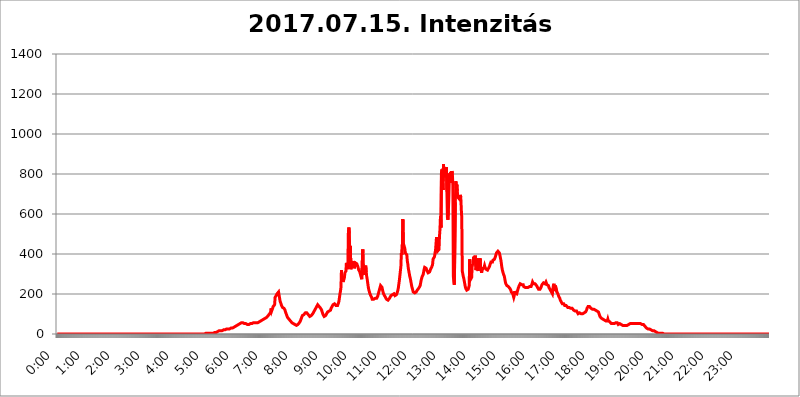
| Category | 2017.07.15. Intenzitás [W/m^2] |
|---|---|
| 0.0 | 0 |
| 0.0006944444444444445 | 0 |
| 0.001388888888888889 | 0 |
| 0.0020833333333333333 | 0 |
| 0.002777777777777778 | 0 |
| 0.003472222222222222 | 0 |
| 0.004166666666666667 | 0 |
| 0.004861111111111111 | 0 |
| 0.005555555555555556 | 0 |
| 0.0062499999999999995 | 0 |
| 0.006944444444444444 | 0 |
| 0.007638888888888889 | 0 |
| 0.008333333333333333 | 0 |
| 0.009027777777777779 | 0 |
| 0.009722222222222222 | 0 |
| 0.010416666666666666 | 0 |
| 0.011111111111111112 | 0 |
| 0.011805555555555555 | 0 |
| 0.012499999999999999 | 0 |
| 0.013194444444444444 | 0 |
| 0.013888888888888888 | 0 |
| 0.014583333333333332 | 0 |
| 0.015277777777777777 | 0 |
| 0.015972222222222224 | 0 |
| 0.016666666666666666 | 0 |
| 0.017361111111111112 | 0 |
| 0.018055555555555557 | 0 |
| 0.01875 | 0 |
| 0.019444444444444445 | 0 |
| 0.02013888888888889 | 0 |
| 0.020833333333333332 | 0 |
| 0.02152777777777778 | 0 |
| 0.022222222222222223 | 0 |
| 0.02291666666666667 | 0 |
| 0.02361111111111111 | 0 |
| 0.024305555555555556 | 0 |
| 0.024999999999999998 | 0 |
| 0.025694444444444447 | 0 |
| 0.02638888888888889 | 0 |
| 0.027083333333333334 | 0 |
| 0.027777777777777776 | 0 |
| 0.02847222222222222 | 0 |
| 0.029166666666666664 | 0 |
| 0.029861111111111113 | 0 |
| 0.030555555555555555 | 0 |
| 0.03125 | 0 |
| 0.03194444444444445 | 0 |
| 0.03263888888888889 | 0 |
| 0.03333333333333333 | 0 |
| 0.034027777777777775 | 0 |
| 0.034722222222222224 | 0 |
| 0.035416666666666666 | 0 |
| 0.036111111111111115 | 0 |
| 0.03680555555555556 | 0 |
| 0.0375 | 0 |
| 0.03819444444444444 | 0 |
| 0.03888888888888889 | 0 |
| 0.03958333333333333 | 0 |
| 0.04027777777777778 | 0 |
| 0.04097222222222222 | 0 |
| 0.041666666666666664 | 0 |
| 0.042361111111111106 | 0 |
| 0.04305555555555556 | 0 |
| 0.043750000000000004 | 0 |
| 0.044444444444444446 | 0 |
| 0.04513888888888889 | 0 |
| 0.04583333333333334 | 0 |
| 0.04652777777777778 | 0 |
| 0.04722222222222222 | 0 |
| 0.04791666666666666 | 0 |
| 0.04861111111111111 | 0 |
| 0.049305555555555554 | 0 |
| 0.049999999999999996 | 0 |
| 0.05069444444444445 | 0 |
| 0.051388888888888894 | 0 |
| 0.052083333333333336 | 0 |
| 0.05277777777777778 | 0 |
| 0.05347222222222222 | 0 |
| 0.05416666666666667 | 0 |
| 0.05486111111111111 | 0 |
| 0.05555555555555555 | 0 |
| 0.05625 | 0 |
| 0.05694444444444444 | 0 |
| 0.057638888888888885 | 0 |
| 0.05833333333333333 | 0 |
| 0.05902777777777778 | 0 |
| 0.059722222222222225 | 0 |
| 0.06041666666666667 | 0 |
| 0.061111111111111116 | 0 |
| 0.06180555555555556 | 0 |
| 0.0625 | 0 |
| 0.06319444444444444 | 0 |
| 0.06388888888888888 | 0 |
| 0.06458333333333334 | 0 |
| 0.06527777777777778 | 0 |
| 0.06597222222222222 | 0 |
| 0.06666666666666667 | 0 |
| 0.06736111111111111 | 0 |
| 0.06805555555555555 | 0 |
| 0.06874999999999999 | 0 |
| 0.06944444444444443 | 0 |
| 0.07013888888888889 | 0 |
| 0.07083333333333333 | 0 |
| 0.07152777777777779 | 0 |
| 0.07222222222222223 | 0 |
| 0.07291666666666667 | 0 |
| 0.07361111111111111 | 0 |
| 0.07430555555555556 | 0 |
| 0.075 | 0 |
| 0.07569444444444444 | 0 |
| 0.0763888888888889 | 0 |
| 0.07708333333333334 | 0 |
| 0.07777777777777778 | 0 |
| 0.07847222222222222 | 0 |
| 0.07916666666666666 | 0 |
| 0.0798611111111111 | 0 |
| 0.08055555555555556 | 0 |
| 0.08125 | 0 |
| 0.08194444444444444 | 0 |
| 0.08263888888888889 | 0 |
| 0.08333333333333333 | 0 |
| 0.08402777777777777 | 0 |
| 0.08472222222222221 | 0 |
| 0.08541666666666665 | 0 |
| 0.08611111111111112 | 0 |
| 0.08680555555555557 | 0 |
| 0.08750000000000001 | 0 |
| 0.08819444444444445 | 0 |
| 0.08888888888888889 | 0 |
| 0.08958333333333333 | 0 |
| 0.09027777777777778 | 0 |
| 0.09097222222222222 | 0 |
| 0.09166666666666667 | 0 |
| 0.09236111111111112 | 0 |
| 0.09305555555555556 | 0 |
| 0.09375 | 0 |
| 0.09444444444444444 | 0 |
| 0.09513888888888888 | 0 |
| 0.09583333333333333 | 0 |
| 0.09652777777777777 | 0 |
| 0.09722222222222222 | 0 |
| 0.09791666666666667 | 0 |
| 0.09861111111111111 | 0 |
| 0.09930555555555555 | 0 |
| 0.09999999999999999 | 0 |
| 0.10069444444444443 | 0 |
| 0.1013888888888889 | 0 |
| 0.10208333333333335 | 0 |
| 0.10277777777777779 | 0 |
| 0.10347222222222223 | 0 |
| 0.10416666666666667 | 0 |
| 0.10486111111111111 | 0 |
| 0.10555555555555556 | 0 |
| 0.10625 | 0 |
| 0.10694444444444444 | 0 |
| 0.1076388888888889 | 0 |
| 0.10833333333333334 | 0 |
| 0.10902777777777778 | 0 |
| 0.10972222222222222 | 0 |
| 0.1111111111111111 | 0 |
| 0.11180555555555556 | 0 |
| 0.11180555555555556 | 0 |
| 0.1125 | 0 |
| 0.11319444444444444 | 0 |
| 0.11388888888888889 | 0 |
| 0.11458333333333333 | 0 |
| 0.11527777777777777 | 0 |
| 0.11597222222222221 | 0 |
| 0.11666666666666665 | 0 |
| 0.1173611111111111 | 0 |
| 0.11805555555555557 | 0 |
| 0.11944444444444445 | 0 |
| 0.12013888888888889 | 0 |
| 0.12083333333333333 | 0 |
| 0.12152777777777778 | 0 |
| 0.12222222222222223 | 0 |
| 0.12291666666666667 | 0 |
| 0.12291666666666667 | 0 |
| 0.12361111111111112 | 0 |
| 0.12430555555555556 | 0 |
| 0.125 | 0 |
| 0.12569444444444444 | 0 |
| 0.12638888888888888 | 0 |
| 0.12708333333333333 | 0 |
| 0.16875 | 0 |
| 0.12847222222222224 | 0 |
| 0.12916666666666668 | 0 |
| 0.12986111111111112 | 0 |
| 0.13055555555555556 | 0 |
| 0.13125 | 0 |
| 0.13194444444444445 | 0 |
| 0.1326388888888889 | 0 |
| 0.13333333333333333 | 0 |
| 0.13402777777777777 | 0 |
| 0.13402777777777777 | 0 |
| 0.13472222222222222 | 0 |
| 0.13541666666666666 | 0 |
| 0.1361111111111111 | 0 |
| 0.13749999999999998 | 0 |
| 0.13819444444444443 | 0 |
| 0.1388888888888889 | 0 |
| 0.13958333333333334 | 0 |
| 0.14027777777777778 | 0 |
| 0.14097222222222222 | 0 |
| 0.14166666666666666 | 0 |
| 0.1423611111111111 | 0 |
| 0.14305555555555557 | 0 |
| 0.14375000000000002 | 0 |
| 0.14444444444444446 | 0 |
| 0.1451388888888889 | 0 |
| 0.1451388888888889 | 0 |
| 0.14652777777777778 | 0 |
| 0.14722222222222223 | 0 |
| 0.14791666666666667 | 0 |
| 0.1486111111111111 | 0 |
| 0.14930555555555555 | 0 |
| 0.15 | 0 |
| 0.15069444444444444 | 0 |
| 0.15138888888888888 | 0 |
| 0.15208333333333332 | 0 |
| 0.15277777777777776 | 0 |
| 0.15347222222222223 | 0 |
| 0.15416666666666667 | 0 |
| 0.15486111111111112 | 0 |
| 0.15555555555555556 | 0 |
| 0.15625 | 0 |
| 0.15694444444444444 | 0 |
| 0.15763888888888888 | 0 |
| 0.15833333333333333 | 0 |
| 0.15902777777777777 | 0 |
| 0.15972222222222224 | 0 |
| 0.16041666666666668 | 0 |
| 0.16111111111111112 | 0 |
| 0.16180555555555556 | 0 |
| 0.1625 | 0 |
| 0.16319444444444445 | 0 |
| 0.1638888888888889 | 0 |
| 0.16458333333333333 | 0 |
| 0.16527777777777777 | 0 |
| 0.16597222222222222 | 0 |
| 0.16666666666666666 | 0 |
| 0.1673611111111111 | 0 |
| 0.16805555555555554 | 0 |
| 0.16874999999999998 | 0 |
| 0.16944444444444443 | 0 |
| 0.17013888888888887 | 0 |
| 0.1708333333333333 | 0 |
| 0.17152777777777775 | 0 |
| 0.17222222222222225 | 0 |
| 0.1729166666666667 | 0 |
| 0.17361111111111113 | 0 |
| 0.17430555555555557 | 0 |
| 0.17500000000000002 | 0 |
| 0.17569444444444446 | 0 |
| 0.1763888888888889 | 0 |
| 0.17708333333333334 | 0 |
| 0.17777777777777778 | 0 |
| 0.17847222222222223 | 0 |
| 0.17916666666666667 | 0 |
| 0.1798611111111111 | 0 |
| 0.18055555555555555 | 0 |
| 0.18125 | 0 |
| 0.18194444444444444 | 0 |
| 0.1826388888888889 | 0 |
| 0.18333333333333335 | 0 |
| 0.1840277777777778 | 0 |
| 0.18472222222222223 | 0 |
| 0.18541666666666667 | 0 |
| 0.18611111111111112 | 0 |
| 0.18680555555555556 | 0 |
| 0.1875 | 0 |
| 0.18819444444444444 | 0 |
| 0.18888888888888888 | 0 |
| 0.18958333333333333 | 0 |
| 0.19027777777777777 | 0 |
| 0.1909722222222222 | 0 |
| 0.19166666666666665 | 0 |
| 0.19236111111111112 | 0 |
| 0.19305555555555554 | 0 |
| 0.19375 | 0 |
| 0.19444444444444445 | 0 |
| 0.1951388888888889 | 0 |
| 0.19583333333333333 | 0 |
| 0.19652777777777777 | 0 |
| 0.19722222222222222 | 0 |
| 0.19791666666666666 | 0 |
| 0.1986111111111111 | 0 |
| 0.19930555555555554 | 0 |
| 0.19999999999999998 | 0 |
| 0.20069444444444443 | 0 |
| 0.20138888888888887 | 0 |
| 0.2020833333333333 | 0 |
| 0.2027777777777778 | 0 |
| 0.2034722222222222 | 0 |
| 0.2041666666666667 | 0 |
| 0.20486111111111113 | 0 |
| 0.20555555555555557 | 0 |
| 0.20625000000000002 | 0 |
| 0.20694444444444446 | 0 |
| 0.2076388888888889 | 3.525 |
| 0.20833333333333334 | 3.525 |
| 0.20902777777777778 | 3.525 |
| 0.20972222222222223 | 3.525 |
| 0.21041666666666667 | 3.525 |
| 0.2111111111111111 | 3.525 |
| 0.21180555555555555 | 3.525 |
| 0.2125 | 3.525 |
| 0.21319444444444444 | 3.525 |
| 0.2138888888888889 | 3.525 |
| 0.21458333333333335 | 3.525 |
| 0.2152777777777778 | 3.525 |
| 0.21597222222222223 | 3.525 |
| 0.21666666666666667 | 3.525 |
| 0.21736111111111112 | 3.525 |
| 0.21805555555555556 | 3.525 |
| 0.21875 | 3.525 |
| 0.21944444444444444 | 7.887 |
| 0.22013888888888888 | 7.887 |
| 0.22083333333333333 | 7.887 |
| 0.22152777777777777 | 7.887 |
| 0.2222222222222222 | 7.887 |
| 0.22291666666666665 | 7.887 |
| 0.2236111111111111 | 7.887 |
| 0.22430555555555556 | 12.257 |
| 0.225 | 12.257 |
| 0.22569444444444445 | 12.257 |
| 0.2263888888888889 | 12.257 |
| 0.22708333333333333 | 16.636 |
| 0.22777777777777777 | 16.636 |
| 0.22847222222222222 | 16.636 |
| 0.22916666666666666 | 16.636 |
| 0.2298611111111111 | 16.636 |
| 0.23055555555555554 | 16.636 |
| 0.23124999999999998 | 16.636 |
| 0.23194444444444443 | 16.636 |
| 0.23263888888888887 | 21.024 |
| 0.2333333333333333 | 21.024 |
| 0.2340277777777778 | 21.024 |
| 0.2347222222222222 | 21.024 |
| 0.2354166666666667 | 21.024 |
| 0.23611111111111113 | 21.024 |
| 0.23680555555555557 | 25.419 |
| 0.23750000000000002 | 25.419 |
| 0.23819444444444446 | 25.419 |
| 0.2388888888888889 | 29.823 |
| 0.23958333333333334 | 25.419 |
| 0.24027777777777778 | 25.419 |
| 0.24097222222222223 | 25.419 |
| 0.24166666666666667 | 25.419 |
| 0.2423611111111111 | 29.823 |
| 0.24305555555555555 | 29.823 |
| 0.24375 | 29.823 |
| 0.24444444444444446 | 29.823 |
| 0.24513888888888888 | 29.823 |
| 0.24583333333333335 | 29.823 |
| 0.2465277777777778 | 34.234 |
| 0.24722222222222223 | 34.234 |
| 0.24791666666666667 | 34.234 |
| 0.24861111111111112 | 34.234 |
| 0.24930555555555556 | 38.653 |
| 0.25 | 38.653 |
| 0.25069444444444444 | 38.653 |
| 0.2513888888888889 | 38.653 |
| 0.2520833333333333 | 43.079 |
| 0.25277777777777777 | 43.079 |
| 0.2534722222222222 | 43.079 |
| 0.25416666666666665 | 47.511 |
| 0.2548611111111111 | 47.511 |
| 0.2555555555555556 | 47.511 |
| 0.25625000000000003 | 51.951 |
| 0.2569444444444445 | 51.951 |
| 0.2576388888888889 | 51.951 |
| 0.25833333333333336 | 56.398 |
| 0.2590277777777778 | 56.398 |
| 0.25972222222222224 | 56.398 |
| 0.2604166666666667 | 56.398 |
| 0.2611111111111111 | 51.951 |
| 0.26180555555555557 | 51.951 |
| 0.2625 | 51.951 |
| 0.26319444444444445 | 51.951 |
| 0.2638888888888889 | 51.951 |
| 0.26458333333333334 | 51.951 |
| 0.2652777777777778 | 51.951 |
| 0.2659722222222222 | 51.951 |
| 0.26666666666666666 | 47.511 |
| 0.2673611111111111 | 47.511 |
| 0.26805555555555555 | 47.511 |
| 0.26875 | 47.511 |
| 0.26944444444444443 | 47.511 |
| 0.2701388888888889 | 47.511 |
| 0.2708333333333333 | 51.951 |
| 0.27152777777777776 | 51.951 |
| 0.2722222222222222 | 51.951 |
| 0.27291666666666664 | 51.951 |
| 0.2736111111111111 | 51.951 |
| 0.2743055555555555 | 56.398 |
| 0.27499999999999997 | 56.398 |
| 0.27569444444444446 | 56.398 |
| 0.27638888888888885 | 56.398 |
| 0.27708333333333335 | 56.398 |
| 0.2777777777777778 | 56.398 |
| 0.27847222222222223 | 56.398 |
| 0.2791666666666667 | 56.398 |
| 0.2798611111111111 | 56.398 |
| 0.28055555555555556 | 56.398 |
| 0.28125 | 56.398 |
| 0.28194444444444444 | 56.398 |
| 0.2826388888888889 | 56.398 |
| 0.2833333333333333 | 60.85 |
| 0.28402777777777777 | 60.85 |
| 0.2847222222222222 | 65.31 |
| 0.28541666666666665 | 65.31 |
| 0.28611111111111115 | 65.31 |
| 0.28680555555555554 | 69.775 |
| 0.28750000000000003 | 69.775 |
| 0.2881944444444445 | 74.246 |
| 0.2888888888888889 | 74.246 |
| 0.28958333333333336 | 74.246 |
| 0.2902777777777778 | 78.722 |
| 0.29097222222222224 | 78.722 |
| 0.2916666666666667 | 78.722 |
| 0.2923611111111111 | 78.722 |
| 0.29305555555555557 | 83.205 |
| 0.29375 | 83.205 |
| 0.29444444444444445 | 87.692 |
| 0.2951388888888889 | 87.692 |
| 0.29583333333333334 | 92.184 |
| 0.2965277777777778 | 92.184 |
| 0.2972222222222222 | 96.682 |
| 0.29791666666666666 | 101.184 |
| 0.2986111111111111 | 101.184 |
| 0.29930555555555555 | 110.201 |
| 0.3 | 128.284 |
| 0.30069444444444443 | 114.716 |
| 0.3013888888888889 | 119.235 |
| 0.3020833333333333 | 128.284 |
| 0.30277777777777776 | 137.347 |
| 0.3034722222222222 | 132.814 |
| 0.30416666666666664 | 137.347 |
| 0.3048611111111111 | 146.423 |
| 0.3055555555555555 | 182.82 |
| 0.30624999999999997 | 187.378 |
| 0.3069444444444444 | 191.937 |
| 0.3076388888888889 | 196.497 |
| 0.30833333333333335 | 201.058 |
| 0.3090277777777778 | 201.058 |
| 0.30972222222222223 | 205.62 |
| 0.3104166666666667 | 210.182 |
| 0.3111111111111111 | 210.182 |
| 0.31180555555555556 | 210.182 |
| 0.3125 | 164.605 |
| 0.31319444444444444 | 164.605 |
| 0.3138888888888889 | 150.964 |
| 0.3145833333333333 | 141.884 |
| 0.31527777777777777 | 137.347 |
| 0.3159722222222222 | 132.814 |
| 0.31666666666666665 | 128.284 |
| 0.31736111111111115 | 128.284 |
| 0.31805555555555554 | 128.284 |
| 0.31875000000000003 | 123.758 |
| 0.3194444444444445 | 119.235 |
| 0.3201388888888889 | 110.201 |
| 0.32083333333333336 | 105.69 |
| 0.3215277777777778 | 96.682 |
| 0.32222222222222224 | 92.184 |
| 0.3229166666666667 | 83.205 |
| 0.3236111111111111 | 83.205 |
| 0.32430555555555557 | 78.722 |
| 0.325 | 74.246 |
| 0.32569444444444445 | 74.246 |
| 0.3263888888888889 | 69.775 |
| 0.32708333333333334 | 65.31 |
| 0.3277777777777778 | 65.31 |
| 0.3284722222222222 | 60.85 |
| 0.32916666666666666 | 56.398 |
| 0.3298611111111111 | 56.398 |
| 0.33055555555555555 | 51.951 |
| 0.33125 | 51.951 |
| 0.33194444444444443 | 47.511 |
| 0.3326388888888889 | 47.511 |
| 0.3333333333333333 | 47.511 |
| 0.3340277777777778 | 47.511 |
| 0.3347222222222222 | 47.511 |
| 0.3354166666666667 | 43.079 |
| 0.3361111111111111 | 43.079 |
| 0.3368055555555556 | 47.511 |
| 0.33749999999999997 | 47.511 |
| 0.33819444444444446 | 47.511 |
| 0.33888888888888885 | 51.951 |
| 0.33958333333333335 | 56.398 |
| 0.34027777777777773 | 60.85 |
| 0.34097222222222223 | 65.31 |
| 0.3416666666666666 | 69.775 |
| 0.3423611111111111 | 78.722 |
| 0.3430555555555555 | 83.205 |
| 0.34375 | 92.184 |
| 0.3444444444444445 | 92.184 |
| 0.3451388888888889 | 96.682 |
| 0.3458333333333334 | 96.682 |
| 0.34652777777777777 | 101.184 |
| 0.34722222222222227 | 101.184 |
| 0.34791666666666665 | 105.69 |
| 0.34861111111111115 | 105.69 |
| 0.34930555555555554 | 105.69 |
| 0.35000000000000003 | 105.69 |
| 0.3506944444444444 | 101.184 |
| 0.3513888888888889 | 101.184 |
| 0.3520833333333333 | 96.682 |
| 0.3527777777777778 | 92.184 |
| 0.3534722222222222 | 92.184 |
| 0.3541666666666667 | 87.692 |
| 0.3548611111111111 | 87.692 |
| 0.35555555555555557 | 87.692 |
| 0.35625 | 92.184 |
| 0.35694444444444445 | 92.184 |
| 0.3576388888888889 | 96.682 |
| 0.35833333333333334 | 101.184 |
| 0.3590277777777778 | 105.69 |
| 0.3597222222222222 | 110.201 |
| 0.36041666666666666 | 114.716 |
| 0.3611111111111111 | 119.235 |
| 0.36180555555555555 | 123.758 |
| 0.3625 | 128.284 |
| 0.36319444444444443 | 132.814 |
| 0.3638888888888889 | 137.347 |
| 0.3645833333333333 | 141.884 |
| 0.3652777777777778 | 146.423 |
| 0.3659722222222222 | 146.423 |
| 0.3666666666666667 | 146.423 |
| 0.3673611111111111 | 137.347 |
| 0.3680555555555556 | 132.814 |
| 0.36874999999999997 | 132.814 |
| 0.36944444444444446 | 128.284 |
| 0.37013888888888885 | 128.284 |
| 0.37083333333333335 | 119.235 |
| 0.37152777777777773 | 110.201 |
| 0.37222222222222223 | 105.69 |
| 0.3729166666666666 | 96.682 |
| 0.3736111111111111 | 92.184 |
| 0.3743055555555555 | 87.692 |
| 0.375 | 83.205 |
| 0.3756944444444445 | 87.692 |
| 0.3763888888888889 | 92.184 |
| 0.3770833333333334 | 96.682 |
| 0.37777777777777777 | 101.184 |
| 0.37847222222222227 | 105.69 |
| 0.37916666666666665 | 110.201 |
| 0.37986111111111115 | 114.716 |
| 0.38055555555555554 | 114.716 |
| 0.38125000000000003 | 114.716 |
| 0.3819444444444444 | 119.235 |
| 0.3826388888888889 | 114.716 |
| 0.3833333333333333 | 119.235 |
| 0.3840277777777778 | 128.284 |
| 0.3847222222222222 | 128.284 |
| 0.3854166666666667 | 137.347 |
| 0.3861111111111111 | 141.884 |
| 0.38680555555555557 | 146.423 |
| 0.3875 | 150.964 |
| 0.38819444444444445 | 150.964 |
| 0.3888888888888889 | 150.964 |
| 0.38958333333333334 | 146.423 |
| 0.3902777777777778 | 146.423 |
| 0.3909722222222222 | 141.884 |
| 0.39166666666666666 | 141.884 |
| 0.3923611111111111 | 141.884 |
| 0.39305555555555555 | 141.884 |
| 0.39375 | 146.423 |
| 0.39444444444444443 | 155.509 |
| 0.3951388888888889 | 164.605 |
| 0.3958333333333333 | 182.82 |
| 0.3965277777777778 | 201.058 |
| 0.3972222222222222 | 214.746 |
| 0.3979166666666667 | 233 |
| 0.3986111111111111 | 319.517 |
| 0.3993055555555556 | 264.932 |
| 0.39999999999999997 | 283.156 |
| 0.40069444444444446 | 260.373 |
| 0.40138888888888885 | 264.932 |
| 0.40208333333333335 | 274.047 |
| 0.40277777777777773 | 283.156 |
| 0.40347222222222223 | 305.898 |
| 0.4041666666666666 | 310.44 |
| 0.4048611111111111 | 314.98 |
| 0.4055555555555555 | 355.712 |
| 0.40625 | 342.162 |
| 0.4069444444444445 | 324.052 |
| 0.4076388888888889 | 351.198 |
| 0.4083333333333334 | 506.542 |
| 0.40902777777777777 | 532.513 |
| 0.40972222222222227 | 502.192 |
| 0.41041666666666665 | 337.639 |
| 0.41111111111111115 | 440.702 |
| 0.41180555555555554 | 324.052 |
| 0.41250000000000003 | 324.052 |
| 0.4131944444444444 | 355.712 |
| 0.4138888888888889 | 333.113 |
| 0.4145833333333333 | 351.198 |
| 0.4152777777777778 | 346.682 |
| 0.4159722222222222 | 364.728 |
| 0.4166666666666667 | 328.584 |
| 0.4173611111111111 | 333.113 |
| 0.41805555555555557 | 355.712 |
| 0.41875 | 351.198 |
| 0.41944444444444445 | 351.198 |
| 0.4201388888888889 | 351.198 |
| 0.42083333333333334 | 346.682 |
| 0.4215277777777778 | 337.639 |
| 0.4222222222222222 | 333.113 |
| 0.42291666666666666 | 319.517 |
| 0.4236111111111111 | 314.98 |
| 0.42430555555555555 | 310.44 |
| 0.425 | 301.354 |
| 0.42569444444444443 | 292.259 |
| 0.4263888888888889 | 283.156 |
| 0.4270833333333333 | 274.047 |
| 0.4277777777777778 | 278.603 |
| 0.4284722222222222 | 422.943 |
| 0.4291666666666667 | 328.584 |
| 0.4298611111111111 | 296.808 |
| 0.4305555555555556 | 301.354 |
| 0.43124999999999997 | 310.44 |
| 0.43194444444444446 | 333.113 |
| 0.43263888888888885 | 342.162 |
| 0.43333333333333335 | 310.44 |
| 0.43402777777777773 | 287.709 |
| 0.43472222222222223 | 274.047 |
| 0.4354166666666666 | 255.813 |
| 0.4361111111111111 | 237.564 |
| 0.4368055555555555 | 223.873 |
| 0.4375 | 214.746 |
| 0.4381944444444445 | 205.62 |
| 0.4388888888888889 | 201.058 |
| 0.4395833333333334 | 191.937 |
| 0.44027777777777777 | 187.378 |
| 0.44097222222222227 | 182.82 |
| 0.44166666666666665 | 173.709 |
| 0.44236111111111115 | 173.709 |
| 0.44305555555555554 | 173.709 |
| 0.44375000000000003 | 173.709 |
| 0.4444444444444444 | 178.264 |
| 0.4451388888888889 | 178.264 |
| 0.4458333333333333 | 178.264 |
| 0.4465277777777778 | 178.264 |
| 0.4472222222222222 | 178.264 |
| 0.4479166666666667 | 178.264 |
| 0.4486111111111111 | 182.82 |
| 0.44930555555555557 | 187.378 |
| 0.45 | 196.497 |
| 0.45069444444444445 | 205.62 |
| 0.4513888888888889 | 214.746 |
| 0.45208333333333334 | 223.873 |
| 0.4527777777777778 | 233 |
| 0.4534722222222222 | 242.127 |
| 0.45416666666666666 | 242.127 |
| 0.4548611111111111 | 237.564 |
| 0.45555555555555555 | 233 |
| 0.45625 | 219.309 |
| 0.45694444444444443 | 210.182 |
| 0.4576388888888889 | 201.058 |
| 0.4583333333333333 | 196.497 |
| 0.4590277777777778 | 191.937 |
| 0.4597222222222222 | 191.937 |
| 0.4604166666666667 | 182.82 |
| 0.4611111111111111 | 182.82 |
| 0.4618055555555556 | 173.709 |
| 0.46249999999999997 | 173.709 |
| 0.46319444444444446 | 169.156 |
| 0.46388888888888885 | 169.156 |
| 0.46458333333333335 | 169.156 |
| 0.46527777777777773 | 173.709 |
| 0.46597222222222223 | 178.264 |
| 0.4666666666666666 | 182.82 |
| 0.4673611111111111 | 182.82 |
| 0.4680555555555555 | 191.937 |
| 0.46875 | 191.937 |
| 0.4694444444444445 | 191.937 |
| 0.4701388888888889 | 196.497 |
| 0.4708333333333334 | 201.058 |
| 0.47152777777777777 | 201.058 |
| 0.47222222222222227 | 201.058 |
| 0.47291666666666665 | 196.497 |
| 0.47361111111111115 | 191.937 |
| 0.47430555555555554 | 191.937 |
| 0.47500000000000003 | 191.937 |
| 0.4756944444444444 | 196.497 |
| 0.4763888888888889 | 201.058 |
| 0.4770833333333333 | 210.182 |
| 0.4777777777777778 | 219.309 |
| 0.4784722222222222 | 233 |
| 0.4791666666666667 | 251.251 |
| 0.4798611111111111 | 269.49 |
| 0.48055555555555557 | 292.259 |
| 0.48125 | 314.98 |
| 0.48194444444444445 | 337.639 |
| 0.4826388888888889 | 405.108 |
| 0.48333333333333334 | 396.164 |
| 0.4840277777777778 | 445.129 |
| 0.4847222222222222 | 575.299 |
| 0.48541666666666666 | 453.968 |
| 0.4861111111111111 | 458.38 |
| 0.48680555555555555 | 453.968 |
| 0.4875 | 427.39 |
| 0.48819444444444443 | 405.108 |
| 0.4888888888888889 | 400.638 |
| 0.4895833333333333 | 405.108 |
| 0.4902777777777778 | 396.164 |
| 0.4909722222222222 | 364.728 |
| 0.4916666666666667 | 351.198 |
| 0.4923611111111111 | 328.584 |
| 0.4930555555555556 | 314.98 |
| 0.49374999999999997 | 301.354 |
| 0.49444444444444446 | 287.709 |
| 0.49513888888888885 | 278.603 |
| 0.49583333333333335 | 264.932 |
| 0.49652777777777773 | 251.251 |
| 0.49722222222222223 | 237.564 |
| 0.4979166666666666 | 228.436 |
| 0.4986111111111111 | 219.309 |
| 0.4993055555555555 | 210.182 |
| 0.5 | 205.62 |
| 0.5006944444444444 | 205.62 |
| 0.5013888888888889 | 205.62 |
| 0.5020833333333333 | 205.62 |
| 0.5027777777777778 | 210.182 |
| 0.5034722222222222 | 210.182 |
| 0.5041666666666667 | 214.746 |
| 0.5048611111111111 | 219.309 |
| 0.5055555555555555 | 219.309 |
| 0.50625 | 223.873 |
| 0.5069444444444444 | 228.436 |
| 0.5076388888888889 | 228.436 |
| 0.5083333333333333 | 233 |
| 0.5090277777777777 | 242.127 |
| 0.5097222222222222 | 255.813 |
| 0.5104166666666666 | 269.49 |
| 0.5111111111111112 | 278.603 |
| 0.5118055555555555 | 287.709 |
| 0.5125000000000001 | 292.259 |
| 0.5131944444444444 | 296.808 |
| 0.513888888888889 | 310.44 |
| 0.5145833333333333 | 324.052 |
| 0.5152777777777778 | 333.113 |
| 0.5159722222222222 | 337.639 |
| 0.5166666666666667 | 337.639 |
| 0.517361111111111 | 328.584 |
| 0.5180555555555556 | 324.052 |
| 0.5187499999999999 | 314.98 |
| 0.5194444444444445 | 310.44 |
| 0.5201388888888888 | 305.898 |
| 0.5208333333333334 | 305.898 |
| 0.5215277777777778 | 305.898 |
| 0.5222222222222223 | 310.44 |
| 0.5229166666666667 | 314.98 |
| 0.5236111111111111 | 324.052 |
| 0.5243055555555556 | 328.584 |
| 0.525 | 333.113 |
| 0.5256944444444445 | 337.639 |
| 0.5263888888888889 | 346.682 |
| 0.5270833333333333 | 373.729 |
| 0.5277777777777778 | 373.729 |
| 0.5284722222222222 | 373.729 |
| 0.5291666666666667 | 387.202 |
| 0.5298611111111111 | 405.108 |
| 0.5305555555555556 | 418.492 |
| 0.53125 | 414.035 |
| 0.5319444444444444 | 484.735 |
| 0.5326388888888889 | 427.39 |
| 0.5333333333333333 | 414.035 |
| 0.5340277777777778 | 409.574 |
| 0.5347222222222222 | 409.574 |
| 0.5354166666666667 | 422.943 |
| 0.5361111111111111 | 489.108 |
| 0.5368055555555555 | 523.88 |
| 0.5375 | 588.009 |
| 0.5381944444444444 | 532.513 |
| 0.5388888888888889 | 806.757 |
| 0.5395833333333333 | 822.26 |
| 0.5402777777777777 | 826.123 |
| 0.5409722222222222 | 719.877 |
| 0.5416666666666666 | 849.199 |
| 0.5423611111111112 | 814.519 |
| 0.5430555555555555 | 806.757 |
| 0.5437500000000001 | 783.342 |
| 0.5444444444444444 | 822.26 |
| 0.545138888888889 | 814.519 |
| 0.5458333333333333 | 833.834 |
| 0.5465277777777778 | 711.832 |
| 0.5472222222222222 | 583.779 |
| 0.5479166666666667 | 571.049 |
| 0.548611111111111 | 617.436 |
| 0.5493055555555556 | 695.666 |
| 0.5499999999999999 | 802.868 |
| 0.5506944444444445 | 802.868 |
| 0.5513888888888888 | 755.766 |
| 0.5520833333333334 | 810.641 |
| 0.5527777777777778 | 798.974 |
| 0.5534722222222223 | 814.519 |
| 0.5541666666666667 | 802.868 |
| 0.5548611111111111 | 743.859 |
| 0.5555555555555556 | 287.709 |
| 0.55625 | 260.373 |
| 0.5569444444444445 | 246.689 |
| 0.5576388888888889 | 242.127 |
| 0.5583333333333333 | 658.909 |
| 0.5590277777777778 | 763.674 |
| 0.5597222222222222 | 731.896 |
| 0.5604166666666667 | 747.834 |
| 0.5611111111111111 | 711.832 |
| 0.5618055555555556 | 683.473 |
| 0.5625 | 687.544 |
| 0.5631944444444444 | 683.473 |
| 0.5638888888888889 | 675.311 |
| 0.5645833333333333 | 683.473 |
| 0.5652777777777778 | 695.666 |
| 0.5659722222222222 | 683.473 |
| 0.5666666666666667 | 625.784 |
| 0.5673611111111111 | 579.542 |
| 0.5680555555555555 | 314.98 |
| 0.56875 | 301.354 |
| 0.5694444444444444 | 287.709 |
| 0.5701388888888889 | 278.603 |
| 0.5708333333333333 | 264.932 |
| 0.5715277777777777 | 251.251 |
| 0.5722222222222222 | 237.564 |
| 0.5729166666666666 | 228.436 |
| 0.5736111111111112 | 223.873 |
| 0.5743055555555555 | 219.309 |
| 0.5750000000000001 | 219.309 |
| 0.5756944444444444 | 219.309 |
| 0.576388888888889 | 223.873 |
| 0.5770833333333333 | 228.436 |
| 0.5777777777777778 | 242.127 |
| 0.5784722222222222 | 373.729 |
| 0.5791666666666667 | 301.354 |
| 0.579861111111111 | 274.047 |
| 0.5805555555555556 | 278.603 |
| 0.5812499999999999 | 283.156 |
| 0.5819444444444445 | 342.162 |
| 0.5826388888888888 | 337.639 |
| 0.5833333333333334 | 351.198 |
| 0.5840277777777778 | 387.202 |
| 0.5847222222222223 | 382.715 |
| 0.5854166666666667 | 373.729 |
| 0.5861111111111111 | 391.685 |
| 0.5868055555555556 | 387.202 |
| 0.5875 | 319.517 |
| 0.5881944444444445 | 342.162 |
| 0.5888888888888889 | 378.224 |
| 0.5895833333333333 | 324.052 |
| 0.5902777777777778 | 314.98 |
| 0.5909722222222222 | 355.712 |
| 0.5916666666666667 | 364.728 |
| 0.5923611111111111 | 351.198 |
| 0.5930555555555556 | 378.224 |
| 0.59375 | 333.113 |
| 0.5944444444444444 | 333.113 |
| 0.5951388888888889 | 305.898 |
| 0.5958333333333333 | 333.113 |
| 0.5965277777777778 | 324.052 |
| 0.5972222222222222 | 328.584 |
| 0.5979166666666667 | 324.052 |
| 0.5986111111111111 | 333.113 |
| 0.5993055555555555 | 342.162 |
| 0.6 | 333.113 |
| 0.6006944444444444 | 333.113 |
| 0.6013888888888889 | 324.052 |
| 0.6020833333333333 | 324.052 |
| 0.6027777777777777 | 319.517 |
| 0.6034722222222222 | 319.517 |
| 0.6041666666666666 | 324.052 |
| 0.6048611111111112 | 328.584 |
| 0.6055555555555555 | 333.113 |
| 0.6062500000000001 | 337.639 |
| 0.6069444444444444 | 346.682 |
| 0.607638888888889 | 351.198 |
| 0.6083333333333333 | 360.221 |
| 0.6090277777777778 | 355.712 |
| 0.6097222222222222 | 360.221 |
| 0.6104166666666667 | 360.221 |
| 0.611111111111111 | 369.23 |
| 0.6118055555555556 | 369.23 |
| 0.6124999999999999 | 369.23 |
| 0.6131944444444445 | 373.729 |
| 0.6138888888888888 | 378.224 |
| 0.6145833333333334 | 387.202 |
| 0.6152777777777778 | 391.685 |
| 0.6159722222222223 | 405.108 |
| 0.6166666666666667 | 409.574 |
| 0.6173611111111111 | 405.108 |
| 0.6180555555555556 | 414.035 |
| 0.61875 | 409.574 |
| 0.6194444444444445 | 414.035 |
| 0.6201388888888889 | 405.108 |
| 0.6208333333333333 | 400.638 |
| 0.6215277777777778 | 400.638 |
| 0.6222222222222222 | 369.23 |
| 0.6229166666666667 | 364.728 |
| 0.6236111111111111 | 333.113 |
| 0.6243055555555556 | 319.517 |
| 0.625 | 310.44 |
| 0.6256944444444444 | 301.354 |
| 0.6263888888888889 | 296.808 |
| 0.6270833333333333 | 287.709 |
| 0.6277777777777778 | 274.047 |
| 0.6284722222222222 | 260.373 |
| 0.6291666666666667 | 251.251 |
| 0.6298611111111111 | 246.689 |
| 0.6305555555555555 | 242.127 |
| 0.63125 | 242.127 |
| 0.6319444444444444 | 237.564 |
| 0.6326388888888889 | 237.564 |
| 0.6333333333333333 | 237.564 |
| 0.6340277777777777 | 233 |
| 0.6347222222222222 | 228.436 |
| 0.6354166666666666 | 223.873 |
| 0.6361111111111112 | 219.309 |
| 0.6368055555555555 | 210.182 |
| 0.6375000000000001 | 210.182 |
| 0.6381944444444444 | 205.62 |
| 0.638888888888889 | 201.058 |
| 0.6395833333333333 | 191.937 |
| 0.6402777777777778 | 182.82 |
| 0.6409722222222222 | 191.937 |
| 0.6416666666666667 | 214.746 |
| 0.642361111111111 | 205.62 |
| 0.6430555555555556 | 201.058 |
| 0.6437499999999999 | 201.058 |
| 0.6444444444444445 | 201.058 |
| 0.6451388888888888 | 196.497 |
| 0.6458333333333334 | 219.309 |
| 0.6465277777777778 | 228.436 |
| 0.6472222222222223 | 233 |
| 0.6479166666666667 | 242.127 |
| 0.6486111111111111 | 246.689 |
| 0.6493055555555556 | 251.251 |
| 0.65 | 251.251 |
| 0.6506944444444445 | 246.689 |
| 0.6513888888888889 | 246.689 |
| 0.6520833333333333 | 246.689 |
| 0.6527777777777778 | 251.251 |
| 0.6534722222222222 | 246.689 |
| 0.6541666666666667 | 237.564 |
| 0.6548611111111111 | 233 |
| 0.6555555555555556 | 233 |
| 0.65625 | 233 |
| 0.6569444444444444 | 233 |
| 0.6576388888888889 | 233 |
| 0.6583333333333333 | 233 |
| 0.6590277777777778 | 233 |
| 0.6597222222222222 | 233 |
| 0.6604166666666667 | 233 |
| 0.6611111111111111 | 233 |
| 0.6618055555555555 | 233 |
| 0.6625 | 237.564 |
| 0.6631944444444444 | 237.564 |
| 0.6638888888888889 | 237.564 |
| 0.6645833333333333 | 237.564 |
| 0.6652777777777777 | 237.564 |
| 0.6659722222222222 | 251.251 |
| 0.6666666666666666 | 260.373 |
| 0.6673611111111111 | 264.932 |
| 0.6680555555555556 | 251.251 |
| 0.6687500000000001 | 246.689 |
| 0.6694444444444444 | 246.689 |
| 0.6701388888888888 | 251.251 |
| 0.6708333333333334 | 251.251 |
| 0.6715277777777778 | 246.689 |
| 0.6722222222222222 | 242.127 |
| 0.6729166666666666 | 237.564 |
| 0.6736111111111112 | 233 |
| 0.6743055555555556 | 228.436 |
| 0.6749999999999999 | 223.873 |
| 0.6756944444444444 | 219.309 |
| 0.6763888888888889 | 219.309 |
| 0.6770833333333334 | 223.873 |
| 0.6777777777777777 | 228.436 |
| 0.6784722222222223 | 233 |
| 0.6791666666666667 | 237.564 |
| 0.6798611111111111 | 246.689 |
| 0.6805555555555555 | 251.251 |
| 0.68125 | 251.251 |
| 0.6819444444444445 | 255.813 |
| 0.6826388888888889 | 255.813 |
| 0.6833333333333332 | 255.813 |
| 0.6840277777777778 | 251.251 |
| 0.6847222222222222 | 255.813 |
| 0.6854166666666667 | 260.373 |
| 0.686111111111111 | 255.813 |
| 0.6868055555555556 | 246.689 |
| 0.6875 | 242.127 |
| 0.6881944444444444 | 242.127 |
| 0.688888888888889 | 242.127 |
| 0.6895833333333333 | 233 |
| 0.6902777777777778 | 228.436 |
| 0.6909722222222222 | 223.873 |
| 0.6916666666666668 | 219.309 |
| 0.6923611111111111 | 214.746 |
| 0.6930555555555555 | 210.182 |
| 0.69375 | 219.309 |
| 0.6944444444444445 | 201.058 |
| 0.6951388888888889 | 205.62 |
| 0.6958333333333333 | 242.127 |
| 0.6965277777777777 | 251.251 |
| 0.6972222222222223 | 228.436 |
| 0.6979166666666666 | 214.746 |
| 0.6986111111111111 | 242.127 |
| 0.6993055555555556 | 237.564 |
| 0.7000000000000001 | 237.564 |
| 0.7006944444444444 | 210.182 |
| 0.7013888888888888 | 205.62 |
| 0.7020833333333334 | 201.058 |
| 0.7027777777777778 | 196.497 |
| 0.7034722222222222 | 187.378 |
| 0.7041666666666666 | 182.82 |
| 0.7048611111111112 | 178.264 |
| 0.7055555555555556 | 169.156 |
| 0.7062499999999999 | 164.605 |
| 0.7069444444444444 | 160.056 |
| 0.7076388888888889 | 155.509 |
| 0.7083333333333334 | 150.964 |
| 0.7090277777777777 | 150.964 |
| 0.7097222222222223 | 150.964 |
| 0.7104166666666667 | 150.964 |
| 0.7111111111111111 | 146.423 |
| 0.7118055555555555 | 141.884 |
| 0.7125 | 141.884 |
| 0.7131944444444445 | 141.884 |
| 0.7138888888888889 | 141.884 |
| 0.7145833333333332 | 137.347 |
| 0.7152777777777778 | 137.347 |
| 0.7159722222222222 | 132.814 |
| 0.7166666666666667 | 132.814 |
| 0.717361111111111 | 132.814 |
| 0.7180555555555556 | 132.814 |
| 0.71875 | 132.814 |
| 0.7194444444444444 | 128.284 |
| 0.720138888888889 | 128.284 |
| 0.7208333333333333 | 128.284 |
| 0.7215277777777778 | 128.284 |
| 0.7222222222222222 | 128.284 |
| 0.7229166666666668 | 123.758 |
| 0.7236111111111111 | 123.758 |
| 0.7243055555555555 | 119.235 |
| 0.725 | 119.235 |
| 0.7256944444444445 | 114.716 |
| 0.7263888888888889 | 114.716 |
| 0.7270833333333333 | 114.716 |
| 0.7277777777777777 | 114.716 |
| 0.7284722222222223 | 114.716 |
| 0.7291666666666666 | 114.716 |
| 0.7298611111111111 | 110.201 |
| 0.7305555555555556 | 101.184 |
| 0.7312500000000001 | 101.184 |
| 0.7319444444444444 | 105.69 |
| 0.7326388888888888 | 105.69 |
| 0.7333333333333334 | 101.184 |
| 0.7340277777777778 | 101.184 |
| 0.7347222222222222 | 101.184 |
| 0.7354166666666666 | 105.69 |
| 0.7361111111111112 | 101.184 |
| 0.7368055555555556 | 101.184 |
| 0.7374999999999999 | 101.184 |
| 0.7381944444444444 | 101.184 |
| 0.7388888888888889 | 105.69 |
| 0.7395833333333334 | 105.69 |
| 0.7402777777777777 | 105.69 |
| 0.7409722222222223 | 110.201 |
| 0.7416666666666667 | 114.716 |
| 0.7423611111111111 | 119.235 |
| 0.7430555555555555 | 128.284 |
| 0.74375 | 132.814 |
| 0.7444444444444445 | 137.347 |
| 0.7451388888888889 | 137.347 |
| 0.7458333333333332 | 137.347 |
| 0.7465277777777778 | 137.347 |
| 0.7472222222222222 | 141.884 |
| 0.7479166666666667 | 137.347 |
| 0.748611111111111 | 128.284 |
| 0.7493055555555556 | 123.758 |
| 0.75 | 123.758 |
| 0.7506944444444444 | 123.758 |
| 0.751388888888889 | 128.284 |
| 0.7520833333333333 | 119.235 |
| 0.7527777777777778 | 123.758 |
| 0.7534722222222222 | 123.758 |
| 0.7541666666666668 | 123.758 |
| 0.7548611111111111 | 119.235 |
| 0.7555555555555555 | 119.235 |
| 0.75625 | 119.235 |
| 0.7569444444444445 | 114.716 |
| 0.7576388888888889 | 114.716 |
| 0.7583333333333333 | 110.201 |
| 0.7590277777777777 | 110.201 |
| 0.7597222222222223 | 110.201 |
| 0.7604166666666666 | 110.201 |
| 0.7611111111111111 | 87.692 |
| 0.7618055555555556 | 87.692 |
| 0.7625000000000001 | 83.205 |
| 0.7631944444444444 | 78.722 |
| 0.7638888888888888 | 74.246 |
| 0.7645833333333334 | 74.246 |
| 0.7652777777777778 | 74.246 |
| 0.7659722222222222 | 74.246 |
| 0.7666666666666666 | 74.246 |
| 0.7673611111111112 | 69.775 |
| 0.7680555555555556 | 69.775 |
| 0.7687499999999999 | 65.31 |
| 0.7694444444444444 | 65.31 |
| 0.7701388888888889 | 65.31 |
| 0.7708333333333334 | 69.775 |
| 0.7715277777777777 | 65.31 |
| 0.7722222222222223 | 74.246 |
| 0.7729166666666667 | 65.31 |
| 0.7736111111111111 | 65.31 |
| 0.7743055555555555 | 60.85 |
| 0.775 | 60.85 |
| 0.7756944444444445 | 56.398 |
| 0.7763888888888889 | 56.398 |
| 0.7770833333333332 | 51.951 |
| 0.7777777777777778 | 51.951 |
| 0.7784722222222222 | 51.951 |
| 0.7791666666666667 | 51.951 |
| 0.779861111111111 | 51.951 |
| 0.7805555555555556 | 51.951 |
| 0.78125 | 51.951 |
| 0.7819444444444444 | 51.951 |
| 0.782638888888889 | 56.398 |
| 0.7833333333333333 | 56.398 |
| 0.7840277777777778 | 56.398 |
| 0.7847222222222222 | 56.398 |
| 0.7854166666666668 | 56.398 |
| 0.7861111111111111 | 51.951 |
| 0.7868055555555555 | 47.511 |
| 0.7875 | 47.511 |
| 0.7881944444444445 | 51.951 |
| 0.7888888888888889 | 51.951 |
| 0.7895833333333333 | 51.951 |
| 0.7902777777777777 | 51.951 |
| 0.7909722222222223 | 47.511 |
| 0.7916666666666666 | 47.511 |
| 0.7923611111111111 | 47.511 |
| 0.7930555555555556 | 43.079 |
| 0.7937500000000001 | 43.079 |
| 0.7944444444444444 | 43.079 |
| 0.7951388888888888 | 43.079 |
| 0.7958333333333334 | 47.511 |
| 0.7965277777777778 | 47.511 |
| 0.7972222222222222 | 43.079 |
| 0.7979166666666666 | 43.079 |
| 0.7986111111111112 | 43.079 |
| 0.7993055555555556 | 43.079 |
| 0.7999999999999999 | 43.079 |
| 0.8006944444444444 | 43.079 |
| 0.8013888888888889 | 47.511 |
| 0.8020833333333334 | 47.511 |
| 0.8027777777777777 | 51.951 |
| 0.8034722222222223 | 51.951 |
| 0.8041666666666667 | 51.951 |
| 0.8048611111111111 | 51.951 |
| 0.8055555555555555 | 51.951 |
| 0.80625 | 51.951 |
| 0.8069444444444445 | 51.951 |
| 0.8076388888888889 | 51.951 |
| 0.8083333333333332 | 51.951 |
| 0.8090277777777778 | 51.951 |
| 0.8097222222222222 | 51.951 |
| 0.8104166666666667 | 51.951 |
| 0.811111111111111 | 51.951 |
| 0.8118055555555556 | 51.951 |
| 0.8125 | 51.951 |
| 0.8131944444444444 | 51.951 |
| 0.813888888888889 | 51.951 |
| 0.8145833333333333 | 51.951 |
| 0.8152777777777778 | 51.951 |
| 0.8159722222222222 | 51.951 |
| 0.8166666666666668 | 51.951 |
| 0.8173611111111111 | 51.951 |
| 0.8180555555555555 | 51.951 |
| 0.81875 | 51.951 |
| 0.8194444444444445 | 51.951 |
| 0.8201388888888889 | 47.511 |
| 0.8208333333333333 | 47.511 |
| 0.8215277777777777 | 47.511 |
| 0.8222222222222223 | 47.511 |
| 0.8229166666666666 | 43.079 |
| 0.8236111111111111 | 43.079 |
| 0.8243055555555556 | 38.653 |
| 0.8250000000000001 | 38.653 |
| 0.8256944444444444 | 34.234 |
| 0.8263888888888888 | 29.823 |
| 0.8270833333333334 | 29.823 |
| 0.8277777777777778 | 29.823 |
| 0.8284722222222222 | 25.419 |
| 0.8291666666666666 | 25.419 |
| 0.8298611111111112 | 25.419 |
| 0.8305555555555556 | 25.419 |
| 0.8312499999999999 | 25.419 |
| 0.8319444444444444 | 21.024 |
| 0.8326388888888889 | 21.024 |
| 0.8333333333333334 | 21.024 |
| 0.8340277777777777 | 21.024 |
| 0.8347222222222223 | 16.636 |
| 0.8354166666666667 | 16.636 |
| 0.8361111111111111 | 12.257 |
| 0.8368055555555555 | 16.636 |
| 0.8375 | 12.257 |
| 0.8381944444444445 | 12.257 |
| 0.8388888888888889 | 12.257 |
| 0.8395833333333332 | 12.257 |
| 0.8402777777777778 | 12.257 |
| 0.8409722222222222 | 7.887 |
| 0.8416666666666667 | 7.887 |
| 0.842361111111111 | 7.887 |
| 0.8430555555555556 | 3.525 |
| 0.84375 | 3.525 |
| 0.8444444444444444 | 3.525 |
| 0.845138888888889 | 3.525 |
| 0.8458333333333333 | 3.525 |
| 0.8465277777777778 | 3.525 |
| 0.8472222222222222 | 3.525 |
| 0.8479166666666668 | 3.525 |
| 0.8486111111111111 | 3.525 |
| 0.8493055555555555 | 3.525 |
| 0.85 | 0 |
| 0.8506944444444445 | 0 |
| 0.8513888888888889 | 0 |
| 0.8520833333333333 | 0 |
| 0.8527777777777777 | 0 |
| 0.8534722222222223 | 0 |
| 0.8541666666666666 | 0 |
| 0.8548611111111111 | 0 |
| 0.8555555555555556 | 0 |
| 0.8562500000000001 | 0 |
| 0.8569444444444444 | 0 |
| 0.8576388888888888 | 0 |
| 0.8583333333333334 | 0 |
| 0.8590277777777778 | 0 |
| 0.8597222222222222 | 0 |
| 0.8604166666666666 | 0 |
| 0.8611111111111112 | 0 |
| 0.8618055555555556 | 0 |
| 0.8624999999999999 | 0 |
| 0.8631944444444444 | 0 |
| 0.8638888888888889 | 0 |
| 0.8645833333333334 | 0 |
| 0.8652777777777777 | 0 |
| 0.8659722222222223 | 0 |
| 0.8666666666666667 | 0 |
| 0.8673611111111111 | 0 |
| 0.8680555555555555 | 0 |
| 0.86875 | 0 |
| 0.8694444444444445 | 0 |
| 0.8701388888888889 | 0 |
| 0.8708333333333332 | 0 |
| 0.8715277777777778 | 0 |
| 0.8722222222222222 | 0 |
| 0.8729166666666667 | 0 |
| 0.873611111111111 | 0 |
| 0.8743055555555556 | 0 |
| 0.875 | 0 |
| 0.8756944444444444 | 0 |
| 0.876388888888889 | 0 |
| 0.8770833333333333 | 0 |
| 0.8777777777777778 | 0 |
| 0.8784722222222222 | 0 |
| 0.8791666666666668 | 0 |
| 0.8798611111111111 | 0 |
| 0.8805555555555555 | 0 |
| 0.88125 | 0 |
| 0.8819444444444445 | 0 |
| 0.8826388888888889 | 0 |
| 0.8833333333333333 | 0 |
| 0.8840277777777777 | 0 |
| 0.8847222222222223 | 0 |
| 0.8854166666666666 | 0 |
| 0.8861111111111111 | 0 |
| 0.8868055555555556 | 0 |
| 0.8875000000000001 | 0 |
| 0.8881944444444444 | 0 |
| 0.8888888888888888 | 0 |
| 0.8895833333333334 | 0 |
| 0.8902777777777778 | 0 |
| 0.8909722222222222 | 0 |
| 0.8916666666666666 | 0 |
| 0.8923611111111112 | 0 |
| 0.8930555555555556 | 0 |
| 0.8937499999999999 | 0 |
| 0.8944444444444444 | 0 |
| 0.8951388888888889 | 0 |
| 0.8958333333333334 | 0 |
| 0.8965277777777777 | 0 |
| 0.8972222222222223 | 0 |
| 0.8979166666666667 | 0 |
| 0.8986111111111111 | 0 |
| 0.8993055555555555 | 0 |
| 0.9 | 0 |
| 0.9006944444444445 | 0 |
| 0.9013888888888889 | 0 |
| 0.9020833333333332 | 0 |
| 0.9027777777777778 | 0 |
| 0.9034722222222222 | 0 |
| 0.9041666666666667 | 0 |
| 0.904861111111111 | 0 |
| 0.9055555555555556 | 0 |
| 0.90625 | 0 |
| 0.9069444444444444 | 0 |
| 0.907638888888889 | 0 |
| 0.9083333333333333 | 0 |
| 0.9090277777777778 | 0 |
| 0.9097222222222222 | 0 |
| 0.9104166666666668 | 0 |
| 0.9111111111111111 | 0 |
| 0.9118055555555555 | 0 |
| 0.9125 | 0 |
| 0.9131944444444445 | 0 |
| 0.9138888888888889 | 0 |
| 0.9145833333333333 | 0 |
| 0.9152777777777777 | 0 |
| 0.9159722222222223 | 0 |
| 0.9166666666666666 | 0 |
| 0.9173611111111111 | 0 |
| 0.9180555555555556 | 0 |
| 0.9187500000000001 | 0 |
| 0.9194444444444444 | 0 |
| 0.9201388888888888 | 0 |
| 0.9208333333333334 | 0 |
| 0.9215277777777778 | 0 |
| 0.9222222222222222 | 0 |
| 0.9229166666666666 | 0 |
| 0.9236111111111112 | 0 |
| 0.9243055555555556 | 0 |
| 0.9249999999999999 | 0 |
| 0.9256944444444444 | 0 |
| 0.9263888888888889 | 0 |
| 0.9270833333333334 | 0 |
| 0.9277777777777777 | 0 |
| 0.9284722222222223 | 0 |
| 0.9291666666666667 | 0 |
| 0.9298611111111111 | 0 |
| 0.9305555555555555 | 0 |
| 0.93125 | 0 |
| 0.9319444444444445 | 0 |
| 0.9326388888888889 | 0 |
| 0.9333333333333332 | 0 |
| 0.9340277777777778 | 0 |
| 0.9347222222222222 | 0 |
| 0.9354166666666667 | 0 |
| 0.936111111111111 | 0 |
| 0.9368055555555556 | 0 |
| 0.9375 | 0 |
| 0.9381944444444444 | 0 |
| 0.938888888888889 | 0 |
| 0.9395833333333333 | 0 |
| 0.9402777777777778 | 0 |
| 0.9409722222222222 | 0 |
| 0.9416666666666668 | 0 |
| 0.9423611111111111 | 0 |
| 0.9430555555555555 | 0 |
| 0.94375 | 0 |
| 0.9444444444444445 | 0 |
| 0.9451388888888889 | 0 |
| 0.9458333333333333 | 0 |
| 0.9465277777777777 | 0 |
| 0.9472222222222223 | 0 |
| 0.9479166666666666 | 0 |
| 0.9486111111111111 | 0 |
| 0.9493055555555556 | 0 |
| 0.9500000000000001 | 0 |
| 0.9506944444444444 | 0 |
| 0.9513888888888888 | 0 |
| 0.9520833333333334 | 0 |
| 0.9527777777777778 | 0 |
| 0.9534722222222222 | 0 |
| 0.9541666666666666 | 0 |
| 0.9548611111111112 | 0 |
| 0.9555555555555556 | 0 |
| 0.9562499999999999 | 0 |
| 0.9569444444444444 | 0 |
| 0.9576388888888889 | 0 |
| 0.9583333333333334 | 0 |
| 0.9590277777777777 | 0 |
| 0.9597222222222223 | 0 |
| 0.9604166666666667 | 0 |
| 0.9611111111111111 | 0 |
| 0.9618055555555555 | 0 |
| 0.9625 | 0 |
| 0.9631944444444445 | 0 |
| 0.9638888888888889 | 0 |
| 0.9645833333333332 | 0 |
| 0.9652777777777778 | 0 |
| 0.9659722222222222 | 0 |
| 0.9666666666666667 | 0 |
| 0.967361111111111 | 0 |
| 0.9680555555555556 | 0 |
| 0.96875 | 0 |
| 0.9694444444444444 | 0 |
| 0.970138888888889 | 0 |
| 0.9708333333333333 | 0 |
| 0.9715277777777778 | 0 |
| 0.9722222222222222 | 0 |
| 0.9729166666666668 | 0 |
| 0.9736111111111111 | 0 |
| 0.9743055555555555 | 0 |
| 0.975 | 0 |
| 0.9756944444444445 | 0 |
| 0.9763888888888889 | 0 |
| 0.9770833333333333 | 0 |
| 0.9777777777777777 | 0 |
| 0.9784722222222223 | 0 |
| 0.9791666666666666 | 0 |
| 0.9798611111111111 | 0 |
| 0.9805555555555556 | 0 |
| 0.9812500000000001 | 0 |
| 0.9819444444444444 | 0 |
| 0.9826388888888888 | 0 |
| 0.9833333333333334 | 0 |
| 0.9840277777777778 | 0 |
| 0.9847222222222222 | 0 |
| 0.9854166666666666 | 0 |
| 0.9861111111111112 | 0 |
| 0.9868055555555556 | 0 |
| 0.9874999999999999 | 0 |
| 0.9881944444444444 | 0 |
| 0.9888888888888889 | 0 |
| 0.9895833333333334 | 0 |
| 0.9902777777777777 | 0 |
| 0.9909722222222223 | 0 |
| 0.9916666666666667 | 0 |
| 0.9923611111111111 | 0 |
| 0.9930555555555555 | 0 |
| 0.99375 | 0 |
| 0.9944444444444445 | 0 |
| 0.9951388888888889 | 0 |
| 0.9958333333333332 | 0 |
| 0.9965277777777778 | 0 |
| 0.9972222222222222 | 0 |
| 0.9979166666666667 | 0 |
| 0.998611111111111 | 0 |
| 0.9993055555555556 | 0 |